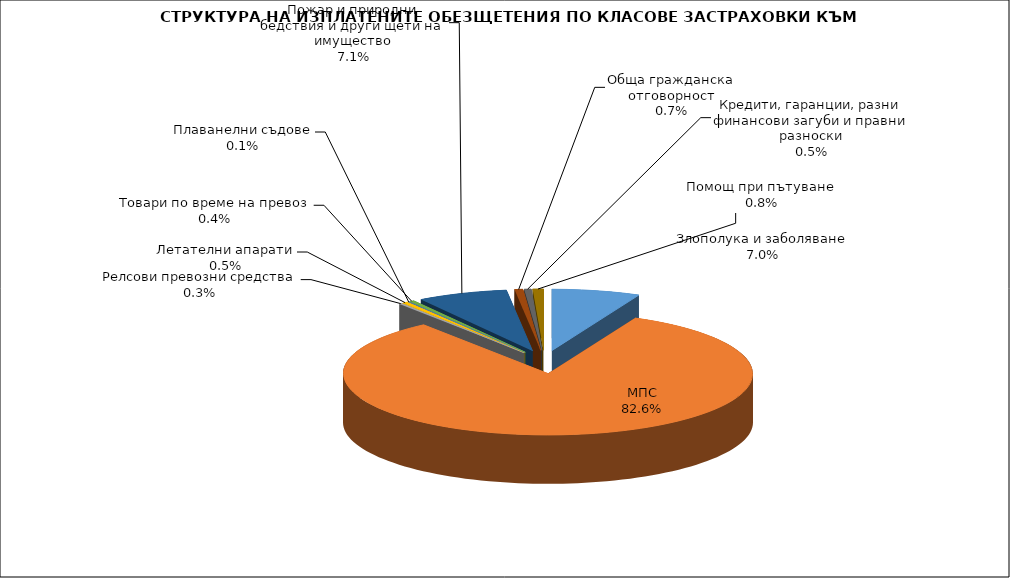
| Category | Злополука и заболяване |
|---|---|
| Злополука и заболяване | 0.07 |
| МПС | 0.826 |
| Релсови превозни средства | 0.003 |
| Летателни апарати | 0.005 |
| Плаванелни съдове | 0.001 |
| Товари по време на превоз | 0.004 |
| Пожар и природни бедствия и други щети на имущество | 0.071 |
| Обща гражданска отговорност | 0.007 |
| Кредити, гаранции, разни финансови загуби и правни разноски | 0.005 |
| Помощ при пътуване | 0.008 |